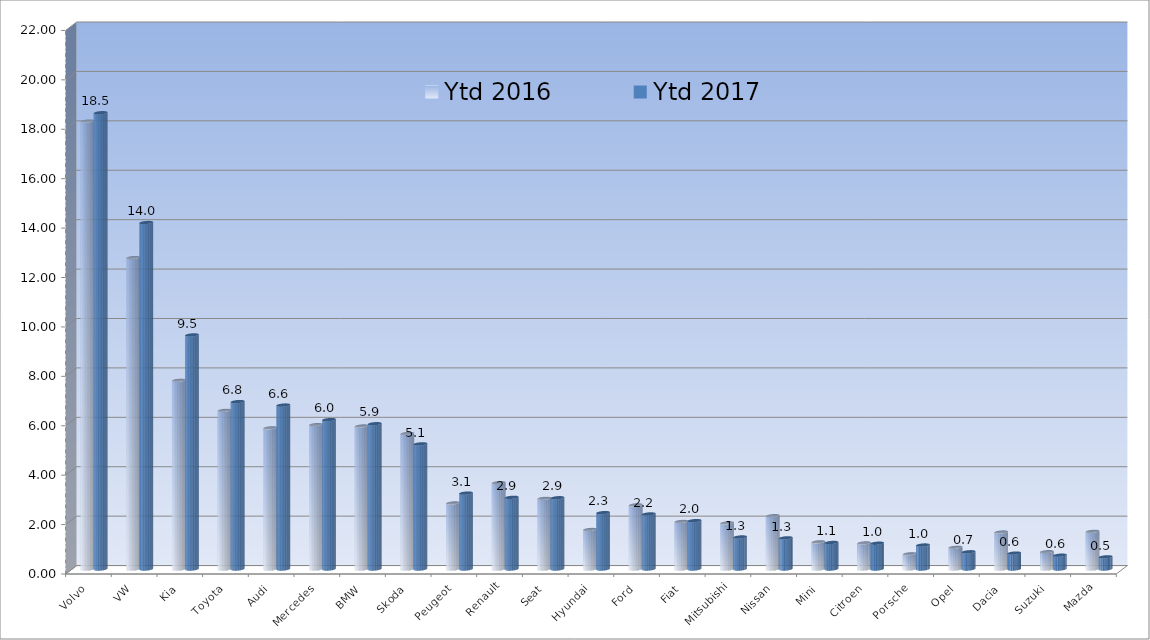
| Category | Ytd 2016 | Ytd 2017 |
|---|---|---|
| Volvo | 18.129 | 18.467 |
| VW | 12.604 | 14.023 |
| Kia | 7.639 | 9.473 |
| Toyota | 6.421 | 6.775 |
| Audi | 5.712 | 6.636 |
| Mercedes | 5.843 | 6.046 |
| BMW | 5.787 | 5.88 |
| Skoda | 5.484 | 5.064 |
| Peugeot | 2.672 | 3.071 |
| Renault | 3.492 | 2.901 |
| Seat | 2.859 | 2.884 |
| Hyundai | 1.599 | 2.28 |
| Ford | 2.594 | 2.227 |
| Fiat | 1.924 | 1.958 |
| Mitsubishi | 1.864 | 1.296 |
| Nissan | 2.156 | 1.26 |
| Mini | 1.099 | 1.073 |
| Citroen | 1.053 | 1.044 |
| Porsche | 0.615 | 0.97 |
| Opel | 0.88 | 0.696 |
| Dacia | 1.496 | 0.644 |
| Suzuki | 0.7 | 0.559 |
| Mazda | 1.523 | 0.492 |